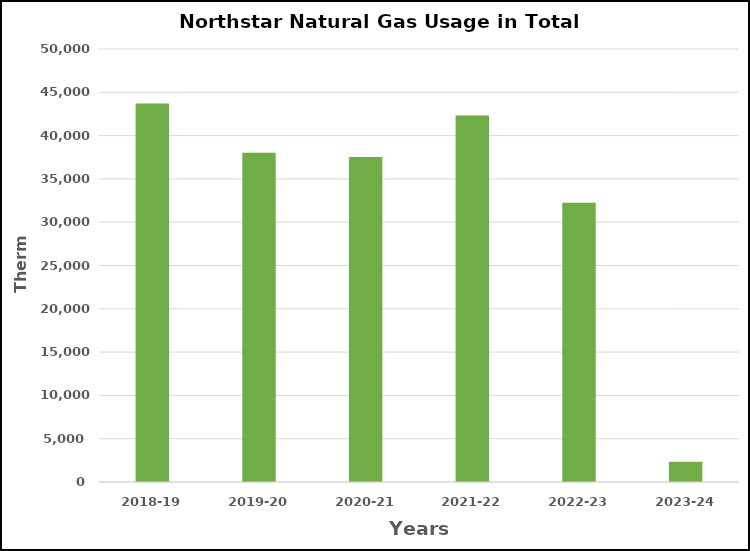
| Category | Series 0 |
|---|---|
| 2018-19 | 43701 |
| 2019-20 | 38032 |
| 2020-21 | 37517 |
| 2021-22 | 42325 |
| 2022-23 | 32253 |
| 2023-24 | 2331 |